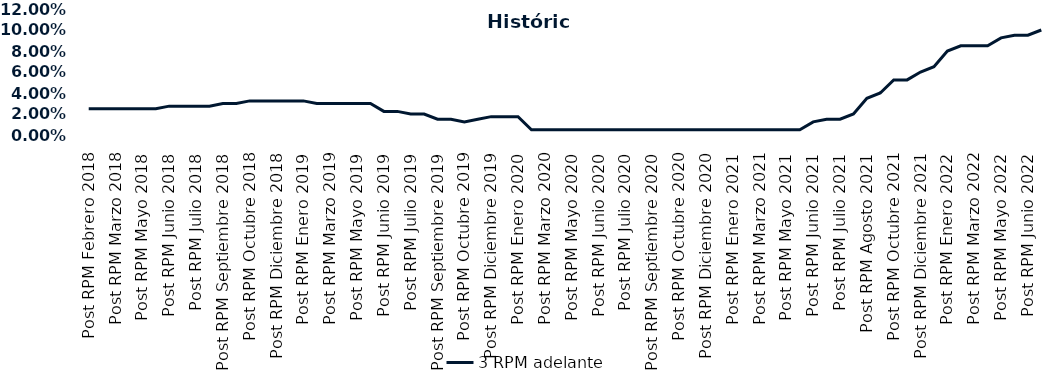
| Category | 3 RPM adelante |
|---|---|
| Post RPM Febrero 2018 | 0.025 |
| Pre RPM Marzo 2018 | 0.025 |
| Post RPM Marzo 2018 | 0.025 |
| Pre RPM Mayo 2018 | 0.025 |
| Post RPM Mayo 2018 | 0.025 |
| Pre RPM Junio 2018 | 0.025 |
| Post RPM Junio 2018 | 0.028 |
| Pre RPM Julio 2018 | 0.028 |
| Post RPM Julio 2018 | 0.028 |
| Pre RPM Septiembre 2018 | 0.028 |
| Post RPM Septiembre 2018 | 0.03 |
| Pre RPM Octubre 2018 | 0.03 |
| Post RPM Octubre 2018 | 0.032 |
| Pre RPM Diciembre 2018 | 0.032 |
| Post RPM Diciembre 2018 | 0.032 |
| Pre RPM Enero 2019 | 0.032 |
| Post RPM Enero 2019 | 0.032 |
| Pre RPM Marzo 2019 | 0.03 |
| Post RPM Marzo 2019 | 0.03 |
| Pre RPM Mayo 2019 | 0.03 |
| Post RPM Mayo 2019 | 0.03 |
| Pre RPM Junio 2019 | 0.03 |
| Post RPM Junio 2019 | 0.022 |
| Pre RPM Julio 2019 | 0.022 |
| Post RPM Julio 2019 | 0.02 |
| Pre RPM Septiembre 2019 | 0.02 |
| Post RPM Septiembre 2019 | 0.015 |
| Pre RPM Octubre 2019 | 0.015 |
| Post RPM Octubre 2019 | 0.012 |
| Pre RPM Diciembre 2019 | 0.015 |
| Post RPM Diciembre 2019 | 0.018 |
| Pre RPM Enero 2020 | 0.018 |
| Post RPM Enero 2020 | 0.018 |
| Pre RPM Marzo 2020 | 0.005 |
| Post RPM Marzo 2020 | 0.005 |
| Pre RPM Mayo 2020 | 0.005 |
| Post RPM Mayo 2020 | 0.005 |
| Pre RPM Junio 2020 | 0.005 |
| Post RPM Junio 2020 | 0.005 |
| Pre RPM Julio 2020 | 0.005 |
| Post RPM Julio 2020 | 0.005 |
| Pre RPM Septiembre 2020 | 0.005 |
| Post RPM Septiembre 2020 | 0.005 |
| Pre RPM Octubre 2020 | 0.005 |
| Post RPM Octubre 2020 | 0.005 |
| Pre RPM Diciembre 2020 | 0.005 |
| Post RPM Diciembre 2020 | 0.005 |
| Pre RPM Enero 2021 | 0.005 |
| Post RPM Enero 2021 | 0.005 |
| Pre RPM Marzo 2021 | 0.005 |
| Post RPM Marzo 2021 | 0.005 |
| Pre RPM Mayo 2021 | 0.005 |
| Post RPM Mayo 2021 | 0.005 |
| Pre RPM Junio 2021 | 0.005 |
| Post RPM Junio 2021 | 0.012 |
| Pre RPM Julio 2021 | 0.015 |
| Post RPM Julio 2021 | 0.015 |
| Pre RPM Agosto 2021 | 0.02 |
| Post RPM Agosto 2021 | 0.035 |
| Pre RPM Octubre 2021 | 0.04 |
| Post RPM Octubre 2021 | 0.052 |
| Pre RPM Diciembre 2021 | 0.052 |
| Post RPM Diciembre 2021 | 0.06 |
| Pre RPM Enero 2022 | 0.065 |
| Post RPM Enero 2022 | 0.08 |
| Pre RPM Marzo 2022 | 0.085 |
| Post RPM Marzo 2022 | 0.085 |
| Pre RPM Mayo 2022 | 0.085 |
| Post RPM Mayo 2022 | 0.092 |
| Pre RPM Junio 2022 | 0.095 |
| Post RPM Junio 2022 | 0.095 |
| Pre RPM Julio 2022 | 0.1 |